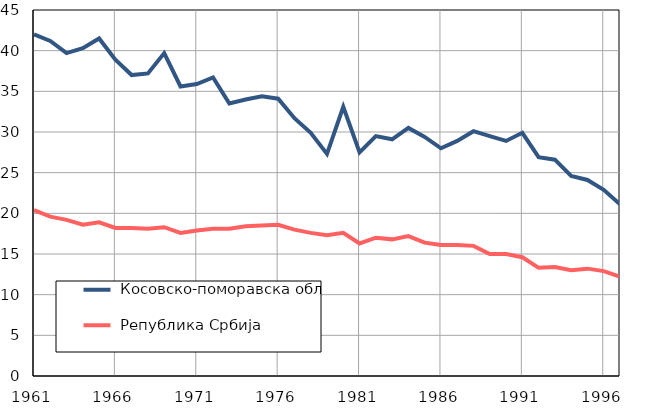
| Category |  Косовско-поморавска област |  Република Србија |
|---|---|---|
| 1961.0 | 42 | 20.4 |
| 1962.0 | 41.2 | 19.6 |
| 1963.0 | 39.7 | 19.2 |
| 1964.0 | 40.3 | 18.6 |
| 1965.0 | 41.5 | 18.9 |
| 1966.0 | 38.9 | 18.2 |
| 1967.0 | 37 | 18.2 |
| 1968.0 | 37.2 | 18.1 |
| 1969.0 | 39.7 | 18.3 |
| 1970.0 | 35.6 | 17.6 |
| 1971.0 | 35.9 | 17.9 |
| 1972.0 | 36.7 | 18.1 |
| 1973.0 | 33.5 | 18.1 |
| 1974.0 | 34 | 18.4 |
| 1975.0 | 34.4 | 18.5 |
| 1976.0 | 34.1 | 18.6 |
| 1977.0 | 31.7 | 18 |
| 1978.0 | 29.9 | 17.6 |
| 1979.0 | 27.3 | 17.3 |
| 1980.0 | 33.1 | 17.6 |
| 1981.0 | 27.5 | 16.3 |
| 1982.0 | 29.5 | 17 |
| 1983.0 | 29.1 | 16.8 |
| 1984.0 | 30.5 | 17.2 |
| 1985.0 | 29.4 | 16.4 |
| 1986.0 | 28 | 16.1 |
| 1987.0 | 28.9 | 16.1 |
| 1988.0 | 30.1 | 16 |
| 1989.0 | 29.5 | 15 |
| 1990.0 | 28.9 | 15 |
| 1991.0 | 29.9 | 14.6 |
| 1992.0 | 26.9 | 13.3 |
| 1993.0 | 26.6 | 13.4 |
| 1994.0 | 24.6 | 13 |
| 1995.0 | 24.1 | 13.2 |
| 1996.0 | 22.9 | 12.9 |
| 1997.0 | 21.1 | 12.2 |